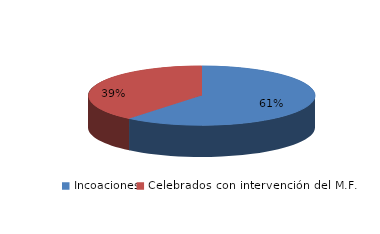
| Category | Series 0 |
|---|---|
| Incoaciones | 7127 |
| Celebrados con intervención del M.F. | 4563 |